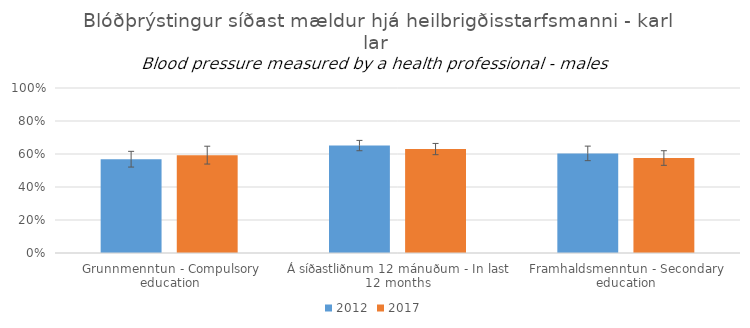
| Category | 2012 | 2017 |
|---|---|---|
| 0 | 0.568 | 0.593 |
| 1 | 0.651 | 0.63 |
| 2 | 0.604 | 0.576 |